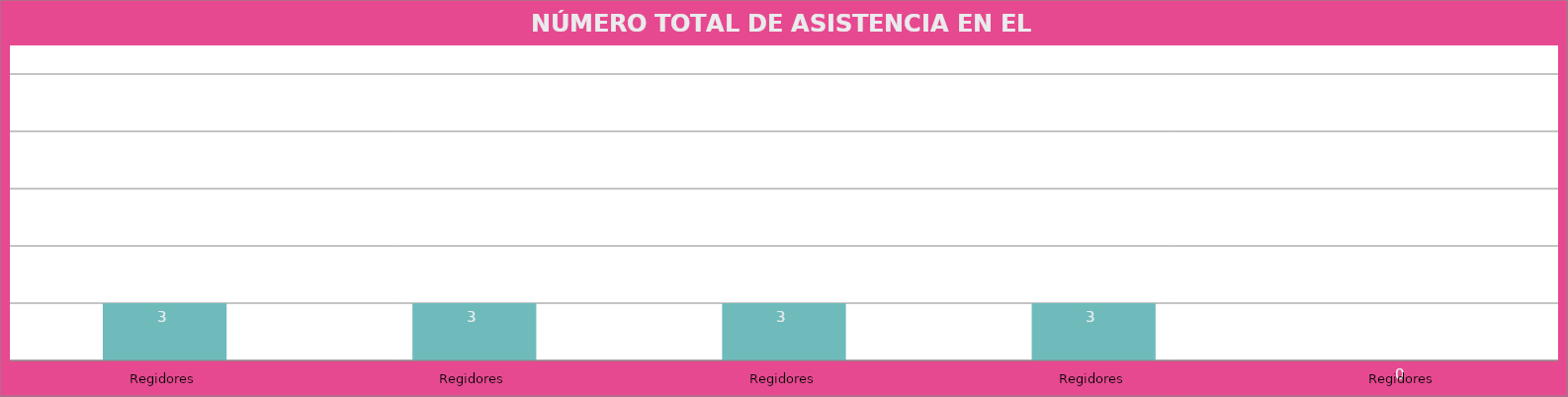
| Category | Regidores |
|---|---|
| Regidores | 3 |
| Regidores | 3 |
| Regidores | 3 |
| Regidores | 3 |
| Regidores | 0 |